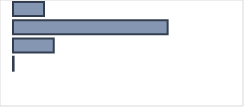
| Category | Series 0 |
|---|---|
| 0 | 13.676 |
| 1 | 68.12 |
| 2 | 17.943 |
| 3 | 0.261 |
| 4 | 0 |